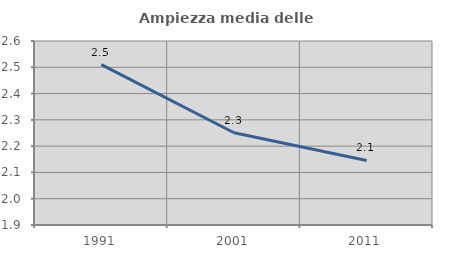
| Category | Ampiezza media delle famiglie |
|---|---|
| 1991.0 | 2.51 |
| 2001.0 | 2.251 |
| 2011.0 | 2.145 |